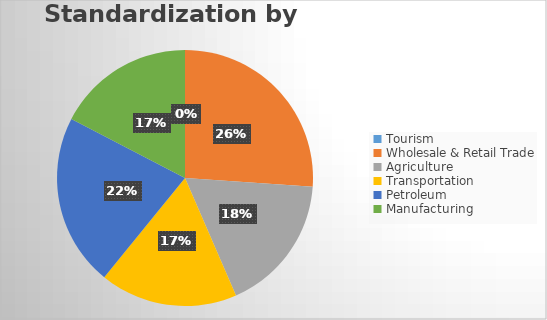
| Category | Series 0 |
|---|---|
| Tourism | 0 |
| Wholesale & Retail Trade | 6 |
| Agriculture | 4 |
| Transportation | 4 |
| Petroleum | 5 |
| Manufacturing | 4 |